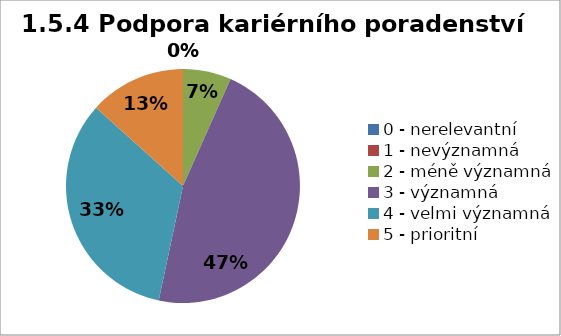
| Category | Series 1 | Series 0 |
|---|---|---|
| 0 - nerelevantní | 0 | 0 |
| 1 - nevýznamná | 0 | 0 |
| 2 - méně významná | 6.667 | 0 |
| 3 - významná | 46.667 | 33.333 |
| 4 - velmi významná | 33.333 | 40 |
| 5 - prioritní | 13.333 | 26.667 |